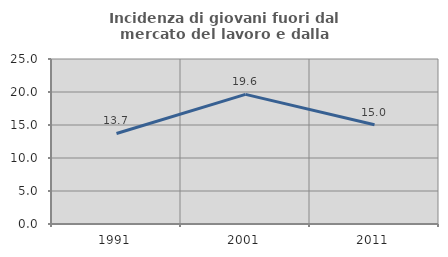
| Category | Incidenza di giovani fuori dal mercato del lavoro e dalla formazione  |
|---|---|
| 1991.0 | 13.719 |
| 2001.0 | 19.639 |
| 2011.0 | 15.04 |